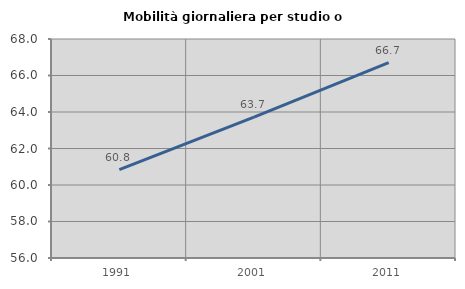
| Category | Mobilità giornaliera per studio o lavoro |
|---|---|
| 1991.0 | 60.844 |
| 2001.0 | 63.72 |
| 2011.0 | 66.706 |